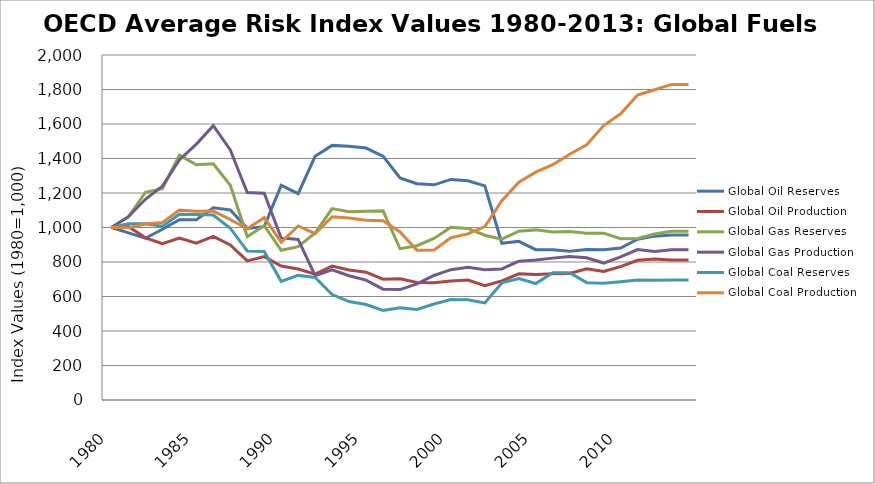
| Category | Global Oil Reserves | Global Oil Production | Global Gas Reserves | Global Gas Production | Global Coal Reserves | Global Coal Production |
|---|---|---|---|---|---|---|
| 1980.0 | 1000 | 1000 | 1000 | 1000 | 1000 | 1000 |
| 1981.0 | 969.114 | 1006.095 | 1061.675 | 1062.881 | 1021.331 | 999.032 |
| 1982.0 | 937.873 | 940.1 | 1204.469 | 1163.723 | 1021.331 | 1020.024 |
| 1983.0 | 989.917 | 906.298 | 1224.91 | 1240.041 | 1007.745 | 1028.625 |
| 1984.0 | 1045.468 | 938.787 | 1419.37 | 1391.836 | 1076.143 | 1100.968 |
| 1985.0 | 1045.024 | 909.312 | 1363.915 | 1483.487 | 1075.445 | 1094.566 |
| 1986.0 | 1114.141 | 948.275 | 1369.072 | 1590.052 | 1072.57 | 1095.322 |
| 1987.0 | 1101.899 | 899.248 | 1244.977 | 1450.116 | 995.882 | 1046.614 |
| 1988.0 | 994.911 | 806.565 | 947.291 | 1203.097 | 864.047 | 992.449 |
| 1989.0 | 1004.664 | 831.069 | 1010.147 | 1199.168 | 861.073 | 1057.253 |
| 1990.0 | 1243.962 | 776.524 | 867.725 | 939.543 | 687.845 | 915.061 |
| 1991.0 | 1195.894 | 759.669 | 888.655 | 930.795 | 722.39 | 1008.828 |
| 1992.0 | 1412.607 | 729.55 | 968.652 | 721.569 | 710.196 | 964.113 |
| 1993.0 | 1475.997 | 777.057 | 1109.803 | 754.997 | 611.243 | 1062.691 |
| 1994.0 | 1470.498 | 753.997 | 1091.955 | 720.328 | 570.867 | 1054.849 |
| 1995.0 | 1460.389 | 741.047 | 1094.701 | 694.863 | 553.645 | 1042.137 |
| 1996.0 | 1413.855 | 700.013 | 1096.347 | 642.545 | 519.51 | 1039.362 |
| 1997.0 | 1287.425 | 702.209 | 877.419 | 640.29 | 534.865 | 974.299 |
| 1998.0 | 1254.076 | 680.897 | 894.337 | 673.162 | 525.383 | 868.629 |
| 1999.0 | 1247.373 | 679.902 | 936.386 | 721.953 | 556.426 | 869.012 |
| 2000.0 | 1278.87 | 689.159 | 1001.367 | 755.457 | 582.103 | 940.926 |
| 2001.0 | 1271.052 | 695.747 | 994.453 | 768.934 | 581.296 | 963.073 |
| 2002.0 | 1241.249 | 662.681 | 955.046 | 755.038 | 562.595 | 1004.849 |
| 2003.0 | 908.708 | 690.774 | 932.345 | 759.853 | 678.757 | 1155.635 |
| 2004.0 | 920.025 | 731.326 | 978.487 | 805.033 | 703.392 | 1262.891 |
| 2005.0 | 871.669 | 727.06 | 986.201 | 811.64 | 675.368 | 1321.023 |
| 2006.0 | 870.584 | 732.225 | 973.927 | 822.468 | 738.366 | 1364.156 |
| 2007.0 | 862.417 | 733.147 | 976.8 | 831.896 | 738.042 | 1424.68 |
| 2008.0 | 872.089 | 760.161 | 967.168 | 824.456 | 680.27 | 1479.344 |
| 2009.0 | 871.136 | 744.813 | 967.074 | 793.892 | 677.153 | 1590.624 |
| 2010.0 | 881.081 | 773.138 | 934.806 | 829.297 | 685.862 | 1658.811 |
| 2011.0 | 931.756 | 809.885 | 936.927 | 871.968 | 695.489 | 1768.39 |
| 2012.0 | 949.913 | 817.69 | 962.554 | 861.241 | 694.751 | 1798.883 |
| 2013.0 | 956.307 | 811.058 | 978.411 | 870.443 | 696.004 | 1829.542 |
| 2014.0 | 956.307 | 811.058 | 978.411 | 870.443 | 696.004 | 1829.542 |